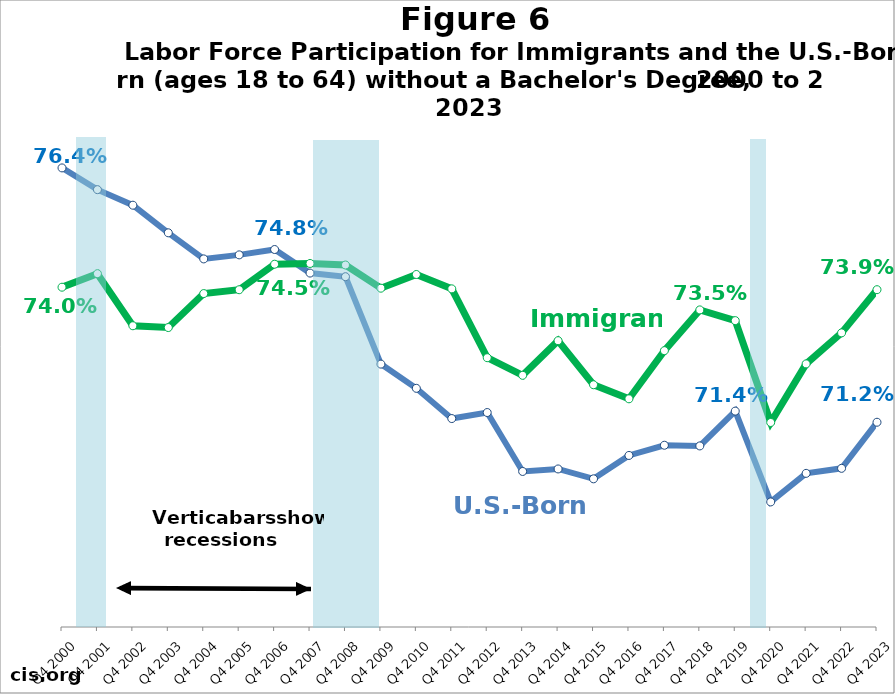
| Category | Native | Immigrant |
|---|---|---|
| Q4 2000 | 0.764 | 0.74 |
| Q4 2001 | 0.76 | 0.743 |
| Q4 2002 | 0.757 | 0.732 |
| Q4 2003 | 0.751 | 0.732 |
| Q4 2004 | 0.746 | 0.739 |
| Q4 2005 | 0.747 | 0.739 |
| Q4 2006 | 0.748 | 0.745 |
| Q4 2007 | 0.743 | 0.745 |
| Q4 2008 | 0.742 | 0.744 |
| Q4 2009 | 0.724 | 0.74 |
| Q4 2010 | 0.719 | 0.743 |
| Q4 2011 | 0.713 | 0.74 |
| Q4 2012 | 0.714 | 0.725 |
| Q4 2013 | 0.702 | 0.722 |
| Q4 2014 | 0.703 | 0.729 |
| Q4 2015 | 0.7 | 0.72 |
| Q4 2016 | 0.705 | 0.717 |
| Q4 2017 | 0.707 | 0.727 |
| Q4 2018 | 0.707 | 0.735 |
| Q4 2019 | 0.714 | 0.733 |
| Q4 2020 | 0.696 | 0.712 |
| Q4 2021 | 0.702 | 0.724 |
| Q4 2022 | 0.703 | 0.731 |
| Q4 2023 | 0.712 | 0.739 |